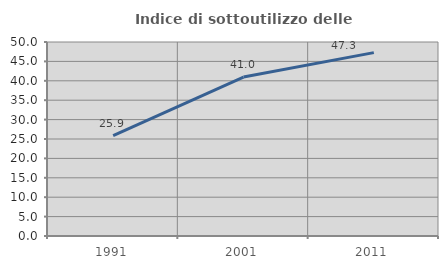
| Category | Indice di sottoutilizzo delle abitazioni  |
|---|---|
| 1991.0 | 25.85 |
| 2001.0 | 40.956 |
| 2011.0 | 47.26 |